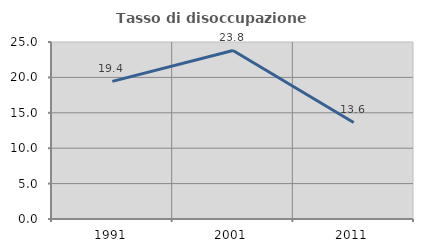
| Category | Tasso di disoccupazione giovanile  |
|---|---|
| 1991.0 | 19.444 |
| 2001.0 | 23.81 |
| 2011.0 | 13.636 |